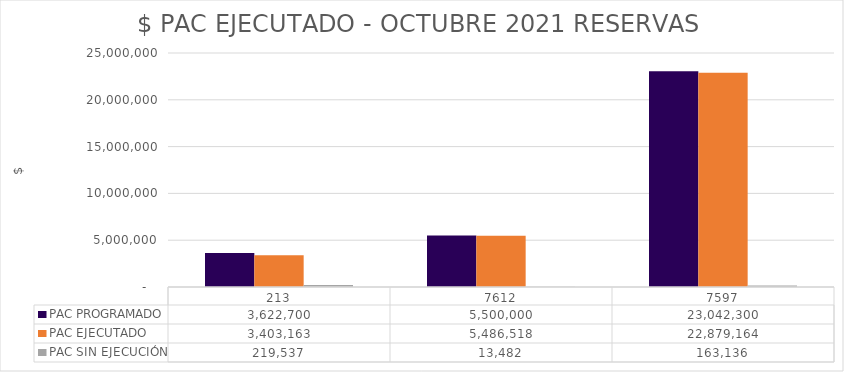
| Category | PAC PROGRAMADO | PAC EJECUTADO | PAC SIN EJECUCIÓN |
|---|---|---|---|
| 213.0 | 3622700 | 3403163 | 219537 |
| 7612.0 | 5500000 | 5486518 | 13482 |
| 7597.0 | 23042300 | 22879164 | 163136 |